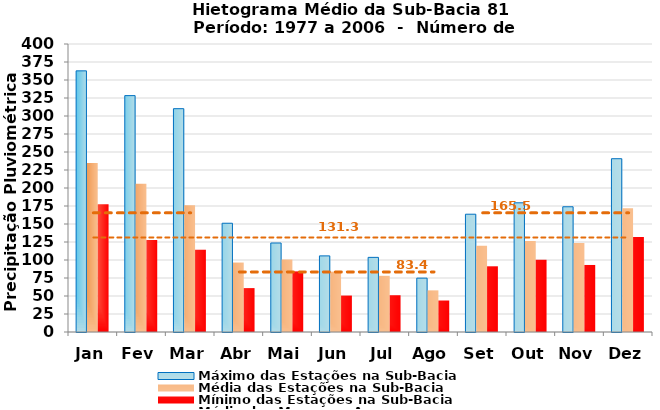
| Category | Máximo das Estações na Sub-Bacia | Média das Estações na Sub-Bacia | Mínimo das Estações na Sub-Bacia |
|---|---|---|---|
| Jan | 362.696 | 234.719 | 177.417 |
| Fev | 328.307 | 206.048 | 127.837 |
| Mar | 310.159 | 176.202 | 114.263 |
| Abr | 151.063 | 96.468 | 60.969 |
| Mai | 123.63 | 100.667 | 84.217 |
| Jun | 105.726 | 83.819 | 50.596 |
| Jul | 103.663 | 78.057 | 51.078 |
| Ago | 74.819 | 57.821 | 43.733 |
| Set | 163.588 | 119.818 | 91.256 |
| Out | 179.437 | 126.333 | 100.322 |
| Nov | 173.954 | 123.468 | 93.1 |
| Dez | 240.678 | 171.704 | 131.93 |